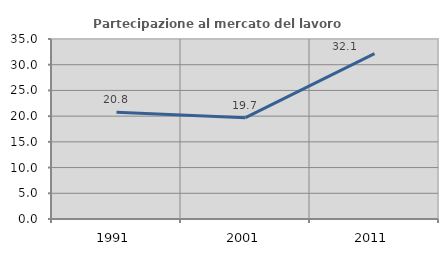
| Category | Partecipazione al mercato del lavoro  femminile |
|---|---|
| 1991.0 | 20.779 |
| 2001.0 | 19.697 |
| 2011.0 | 32.143 |